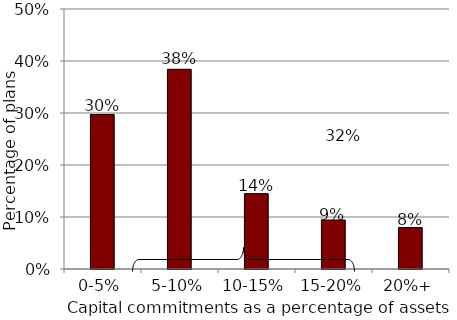
| Category | Series 0 |
|---|---|
| 0-5% | 0.297 |
| 5-10% | 0.384 |
| 10-15% | 0.145 |
| 15-20% | 0.094 |
| 20%+ | 0.08 |